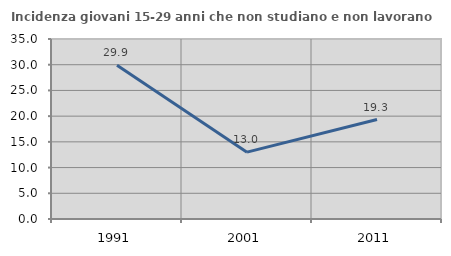
| Category | Incidenza giovani 15-29 anni che non studiano e non lavorano  |
|---|---|
| 1991.0 | 29.907 |
| 2001.0 | 12.996 |
| 2011.0 | 19.342 |